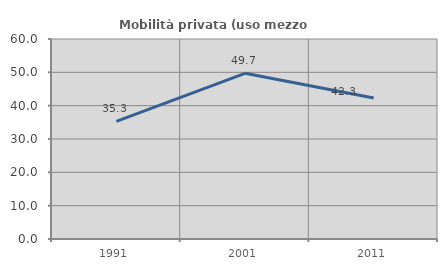
| Category | Mobilità privata (uso mezzo privato) |
|---|---|
| 1991.0 | 35.294 |
| 2001.0 | 49.701 |
| 2011.0 | 42.282 |